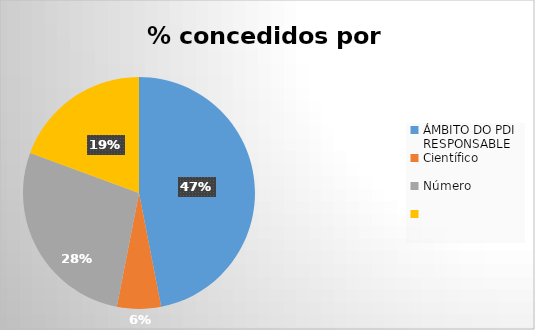
| Category | Total xeral |
|---|---|
| 0 | 46 |
| 1 | 6 |
| 2 | 27 |
| 3 | 19 |